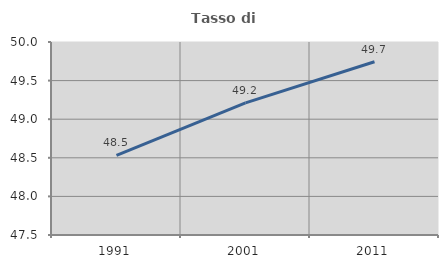
| Category | Tasso di occupazione   |
|---|---|
| 1991.0 | 48.532 |
| 2001.0 | 49.211 |
| 2011.0 | 49.744 |